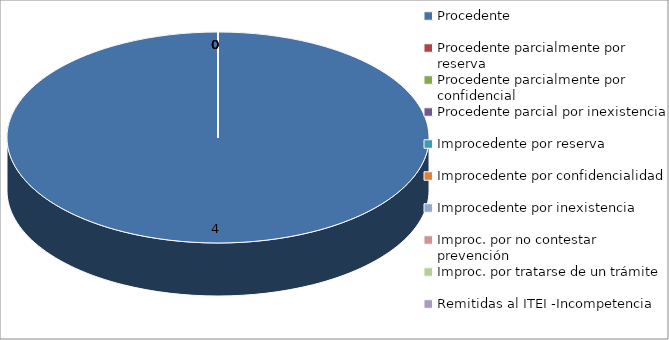
| Category | Series 0 |
|---|---|
| Procedente | 4 |
| Procedente parcialmente por reserva  | 0 |
| Procedente parcialmente por confidencial | 0 |
| Procedente parcial por inexistencia | 0 |
| Improcedente por reserva  | 0 |
| Improcedente por confidencialidad | 0 |
| Improcedente por inexistencia  | 0 |
| Improc. por no contestar prevención | 0 |
| Improc. por tratarse de un trámite  | 0 |
| Remitidas al ITEI -Incompetencia  | 0 |